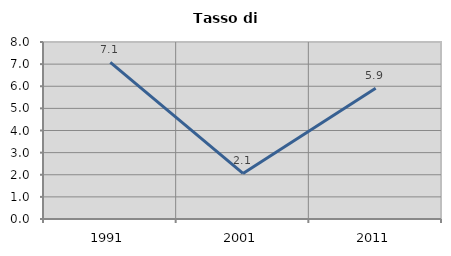
| Category | Tasso di disoccupazione   |
|---|---|
| 1991.0 | 7.078 |
| 2001.0 | 2.06 |
| 2011.0 | 5.908 |